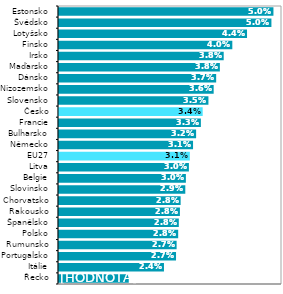
| Category | Series 0 |
|---|---|
| Řecko | 0.016 |
| Itálie | 0.024 |
| Portugalsko | 0.027 |
| Rumunsko | 0.027 |
| Polsko | 0.028 |
| Španělsko | 0.028 |
| Rakousko | 0.028 |
| Chorvatsko | 0.028 |
| Slovinsko | 0.029 |
| Belgie | 0.03 |
| Litva | 0.03 |
| EU27 | 0.031 |
| Německo | 0.031 |
| Bulharsko | 0.032 |
| Francie | 0.033 |
| Česko | 0.034 |
| Slovensko | 0.035 |
| Nizozemsko | 0.036 |
| Dánsko | 0.037 |
| Maďarsko | 0.038 |
| Irsko | 0.038 |
| Finsko | 0.04 |
| Lotyšsko | 0.044 |
| Švédsko | 0.05 |
| Estonsko | 0.05 |